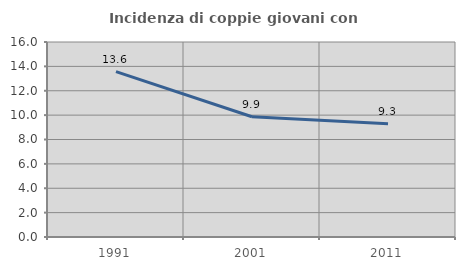
| Category | Incidenza di coppie giovani con figli |
|---|---|
| 1991.0 | 13.564 |
| 2001.0 | 9.865 |
| 2011.0 | 9.3 |